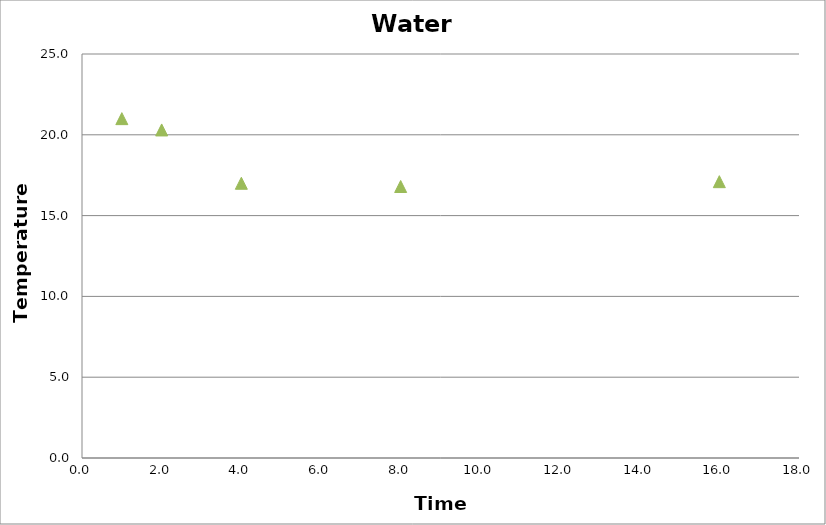
| Category | Series 2 |
|---|---|
| 1.0 | 21 |
| 2.0 | 20.3 |
| 4.0 | 17 |
| 8.0 | 16.8 |
| 16.0 | 17.1 |